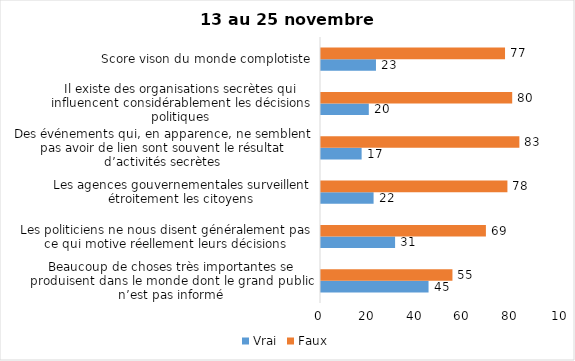
| Category | Vrai | Faux |
|---|---|---|
| Beaucoup de choses très importantes se produisent dans le monde dont le grand public n’est pas informé | 45 | 55 |
| Les politiciens ne nous disent généralement pas ce qui motive réellement leurs décisions | 31 | 69 |
| Les agences gouvernementales surveillent étroitement les citoyens | 22 | 78 |
| Des événements qui, en apparence, ne semblent pas avoir de lien sont souvent le résultat d’activités secrètes | 17 | 83 |
| Il existe des organisations secrètes qui influencent considérablement les décisions politiques | 20 | 80 |
| Score vison du monde complotiste | 23 | 77 |